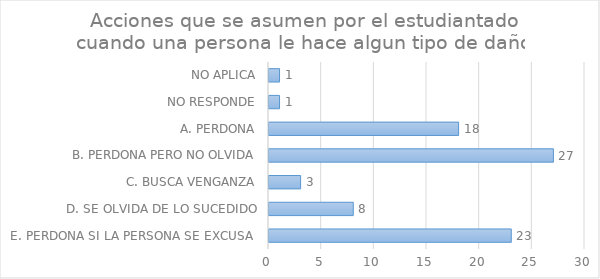
| Category | Series 0 |
|---|---|
| E. PERDONA SI LA PERSONA SE EXCUSA  | 23 |
| D. SE OLVIDA DE LO SUCEDIDO | 8 |
| C. BUSCA VENGANZA | 3 |
| B. PERDONA PERO NO OLVIDA | 27 |
| A. PERDONA | 18 |
| NO RESPONDE | 1 |
| NO APLICA | 1 |